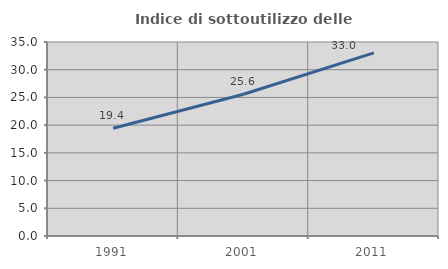
| Category | Indice di sottoutilizzo delle abitazioni  |
|---|---|
| 1991.0 | 19.444 |
| 2001.0 | 25.574 |
| 2011.0 | 33.041 |